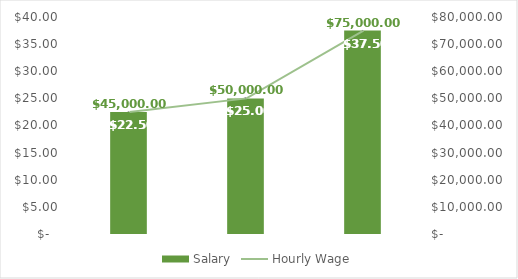
| Category | Salary |
|---|---|
| Web Designer | 45000 |
| Training | 50000 |
| Sales | 75000 |